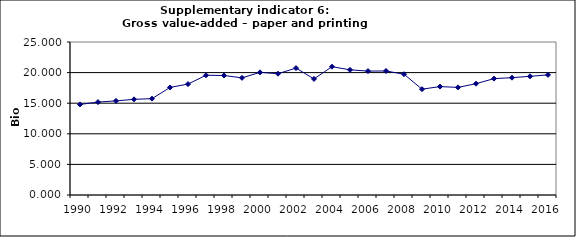
| Category | Gross value-added – paper and printing industry, Bio Euro (EC95) |
|---|---|
| 1990 | 14.798 |
| 1991 | 15.185 |
| 1992 | 15.377 |
| 1993 | 15.633 |
| 1994 | 15.743 |
| 1995 | 17.574 |
| 1996 | 18.125 |
| 1997 | 19.566 |
| 1998 | 19.526 |
| 1999 | 19.143 |
| 2000 | 20.04 |
| 2001 | 19.815 |
| 2002 | 20.741 |
| 2003 | 18.965 |
| 2004 | 20.97 |
| 2005 | 20.449 |
| 2006 | 20.25 |
| 2007 | 20.265 |
| 2008 | 19.735 |
| 2009 | 17.29 |
| 2010 | 17.715 |
| 2011 | 17.582 |
| 2012 | 18.188 |
| 2013 | 19.016 |
| 2014 | 19.169 |
| 2015 | 19.394 |
| 2016 | 19.628 |